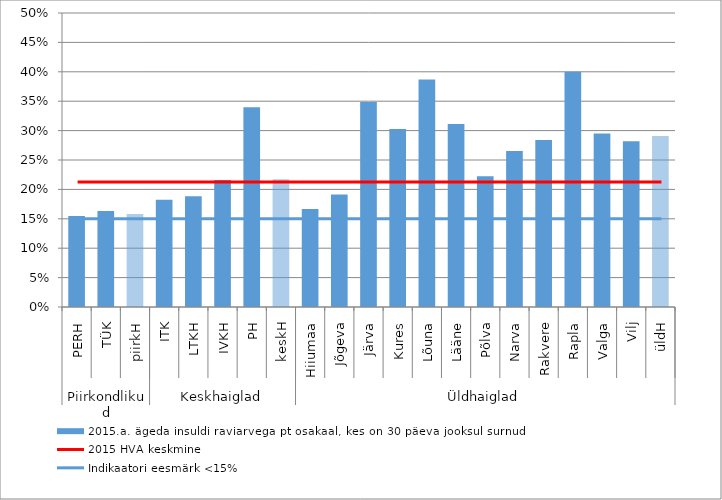
| Category | 2015.a. ägeda insuldi raviarvega pt osakaal, kes on 30 päeva jooksul surnud |
|---|---|
| 0 | 0.155 |
| 1 | 0.163 |
| 2 | 0.158 |
| 3 | 0.183 |
| 4 | 0.188 |
| 5 | 0.216 |
| 6 | 0.34 |
| 7 | 0.217 |
| 8 | 0.167 |
| 9 | 0.191 |
| 10 | 0.348 |
| 11 | 0.303 |
| 12 | 0.387 |
| 13 | 0.311 |
| 14 | 0.222 |
| 15 | 0.265 |
| 16 | 0.284 |
| 17 | 0.4 |
| 18 | 0.295 |
| 19 | 0.282 |
| 20 | 0.291 |